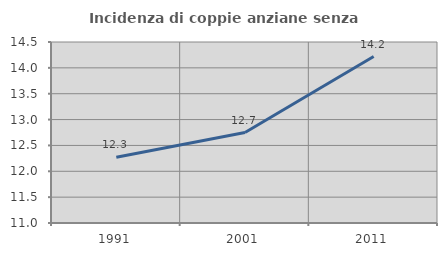
| Category | Incidenza di coppie anziane senza figli  |
|---|---|
| 1991.0 | 12.27 |
| 2001.0 | 12.749 |
| 2011.0 | 14.218 |